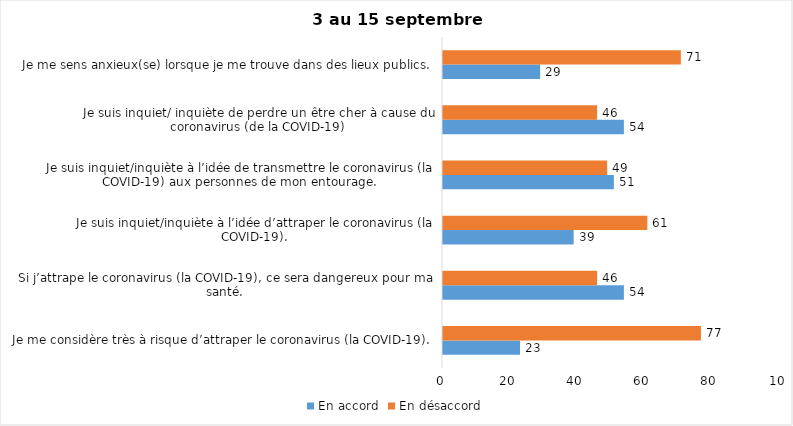
| Category | En accord | En désaccord |
|---|---|---|
| Je me considère très à risque d’attraper le coronavirus (la COVID-19). | 23 | 77 |
| Si j’attrape le coronavirus (la COVID-19), ce sera dangereux pour ma santé. | 54 | 46 |
| Je suis inquiet/inquiète à l’idée d’attraper le coronavirus (la COVID-19). | 39 | 61 |
| Je suis inquiet/inquiète à l’idée de transmettre le coronavirus (la COVID-19) aux personnes de mon entourage. | 51 | 49 |
| Je suis inquiet/ inquiète de perdre un être cher à cause du coronavirus (de la COVID-19) | 54 | 46 |
| Je me sens anxieux(se) lorsque je me trouve dans des lieux publics. | 29 | 71 |